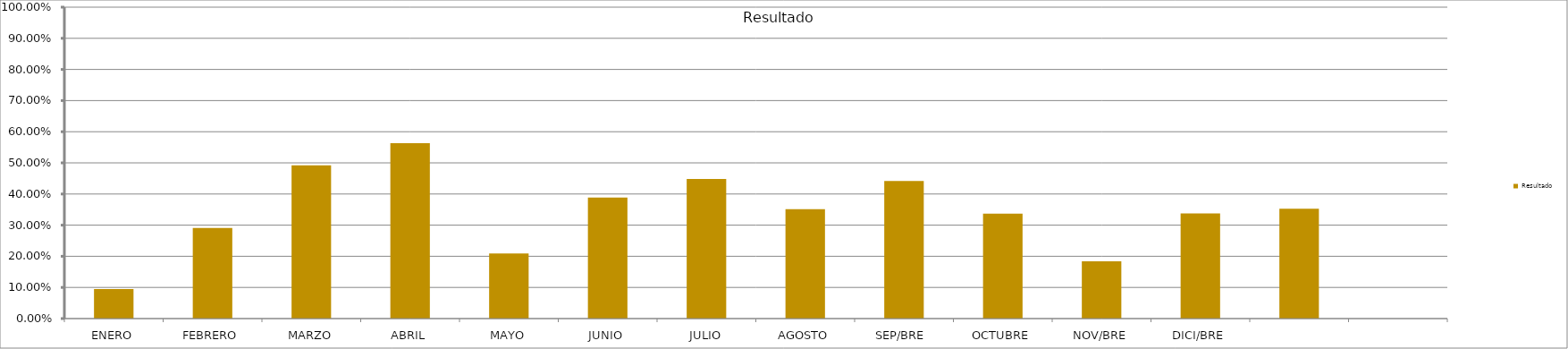
| Category | Resultado  |
|---|---|
| ENERO | 0.095 |
| FEBRERO | 0.291 |
| MARZO | 0.492 |
| ABRIL | 0.564 |
| MAYO | 0.209 |
| JUNIO | 0.389 |
| JULIO | 0.448 |
| AGOSTO | 0.351 |
| SEP/BRE  | 0.442 |
| OCTUBRE | 0.337 |
| NOV/BRE | 0.184 |
| DICI/BRE | 0.337 |